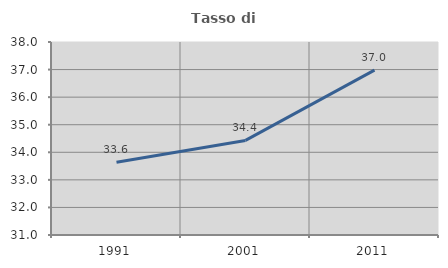
| Category | Tasso di occupazione   |
|---|---|
| 1991.0 | 33.635 |
| 2001.0 | 34.43 |
| 2011.0 | 36.982 |